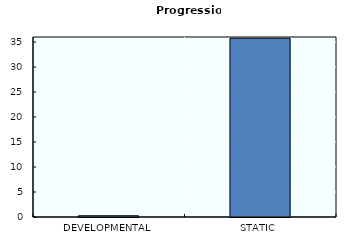
| Category | Progression |
|---|---|
| DEVELOPMENTAL | 0.25 |
| STATIC | 35.75 |